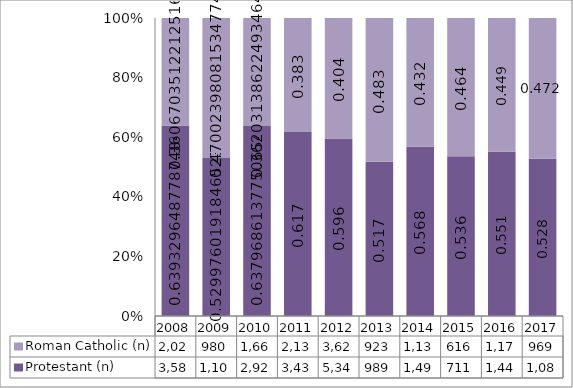
| Category | Protestant (n) | Roman Catholic (n) |
|---|---|---|
| 2008.0 | 3586 | 2023 |
| 2009.0 | 1105 | 980 |
| 2010.0 | 2927 | 1661 |
| 2011.0 | 3439 | 2133 |
| 2012.0 | 5342 | 3623 |
| 2013.0 | 989 | 923 |
| 2014.0 | 1493 | 1135 |
| 2015.0 | 711 | 616 |
| 2016.0 | 1441 | 1174 |
| 2017.0 | 1084 | 969 |